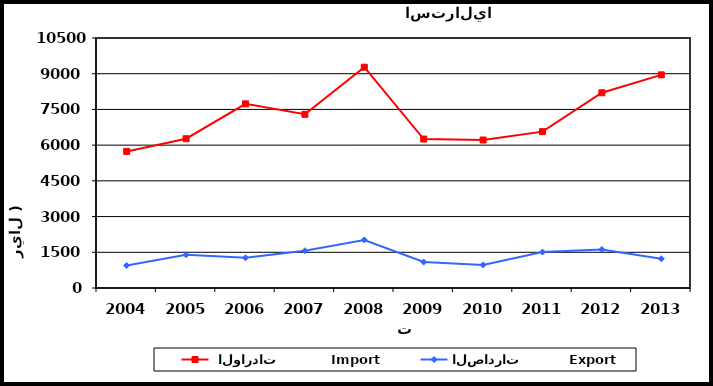
| Category |  الواردات           Import | الصادرات          Export |
|---|---|---|
| 2004.0 | 5737 | 946 |
| 2005.0 | 6270 | 1394 |
| 2006.0 | 7734 | 1269 |
| 2007.0 | 7296 | 1565 |
| 2008.0 | 9274 | 2018 |
| 2009.0 | 6256 | 1091 |
| 2010.0 | 6216 | 970 |
| 2011.0 | 6567 | 1510 |
| 2012.0 | 8199 | 1616 |
| 2013.0 | 8952 | 1227 |